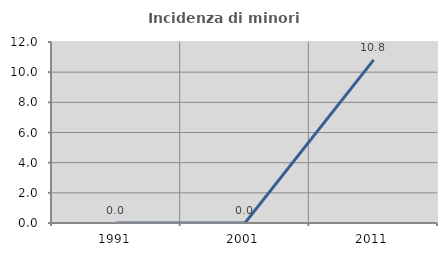
| Category | Incidenza di minori stranieri |
|---|---|
| 1991.0 | 0 |
| 2001.0 | 0 |
| 2011.0 | 10.811 |